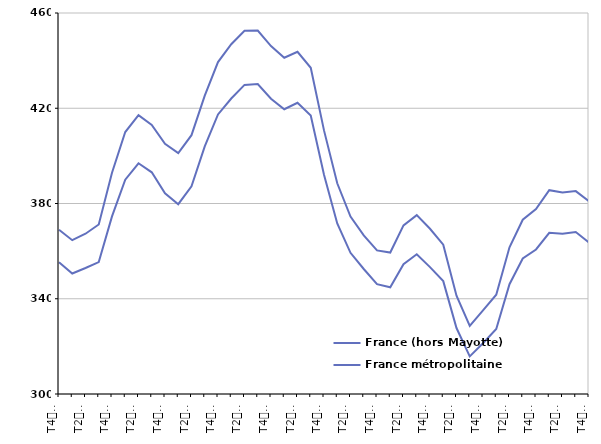
| Category | France (hors Mayotte) | France métropolitaine |
|---|---|---|
| T4
2012 | 369 | 355.3 |
| T1
2013 | 364.6 | 350.6 |
| T2
2013 | 367.3 | 352.9 |
| T3
2013 | 371.2 | 355.4 |
| T4
2013 | 392.9 | 374.6 |
| T1
2014 | 410 | 390 |
| T2
2014 | 417.1 | 396.9 |
| T3
2014 | 413 | 393.1 |
| T4
2014 | 405.1 | 384.3 |
| T1
2015 | 401.2 | 379.7 |
| T2
2015 | 408.7 | 387.2 |
| T3
2015 | 425.3 | 404 |
| T4
2015 | 439.4 | 417.4 |
| T1
2016 | 446.9 | 424.1 |
| T2
2016 | 452.5 | 429.8 |
| T3
2016 | 452.6 | 430.2 |
| T4
2016 | 446.1 | 424 |
| T1
2017 | 441.2 | 419.6 |
| T2
2017 | 443.7 | 422.3 |
| T3
2017 | 437 | 416.9 |
| T4
2017 | 410.7 | 392.1 |
| T1
2018 | 388.5 | 371.6 |
| T2
2018 | 374.5 | 359.3 |
| T3
2018 | 366.6 | 352.5 |
| T4
2018 | 360.3 | 346.1 |
| T1
2019 | 359.4 | 344.8 |
| T2
2019 | 370.8 | 354.5 |
| T3
2019 | 375.1 | 358.7 |
| T4
2019 | 369.4 | 353.3 |
| T1
2020 | 362.7 | 347.4 |
| T2
2020 | 341.3 | 327.7 |
| T3
2020 | 328.6 | 315.8 |
| T4
2020 | 335.1 | 321.3 |
| T1
2021 | 341.7 | 327.3 |
| T2
2021 | 361.6 | 346.1 |
| T3
2021 | 373.2 | 356.9 |
| T4
2021 | 377.7 | 360.7 |
| T1
2022 | 385.6 | 367.7 |
| T2
2022 | 384.6 | 367.3 |
| T3
2022 | 385.2 | 368 |
| T4
2022 | 380.9 | 363.6 |